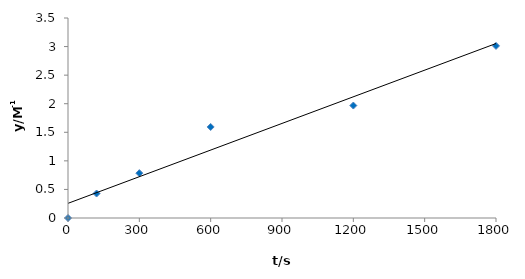
| Category | Series 0 |
|---|---|
| 0.0 | 0 |
| 120.0 | 0.428 |
| 300.0 | 0.785 |
| 600.0 | 1.593 |
| 1200.0 | 1.968 |
| 1800.0 | 3.012 |